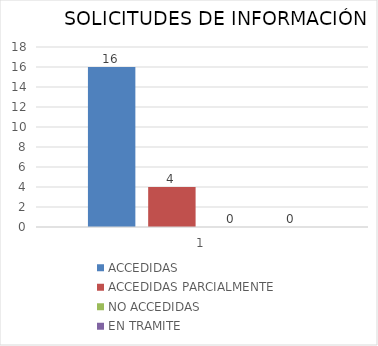
| Category | ACCEDIDAS | ACCEDIDAS PARCIALMENTE | NO ACCEDIDAS | EN TRAMITE |
|---|---|---|---|---|
| 0 | 16 | 4 | 0 | 0 |